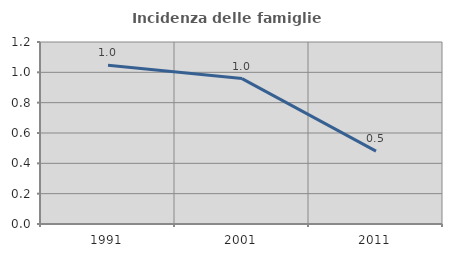
| Category | Incidenza delle famiglie numerose |
|---|---|
| 1991.0 | 1.046 |
| 2001.0 | 0.959 |
| 2011.0 | 0.481 |